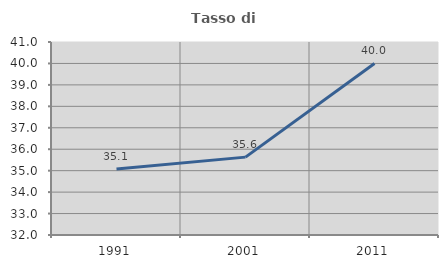
| Category | Tasso di occupazione   |
|---|---|
| 1991.0 | 35.076 |
| 2001.0 | 35.631 |
| 2011.0 | 40 |